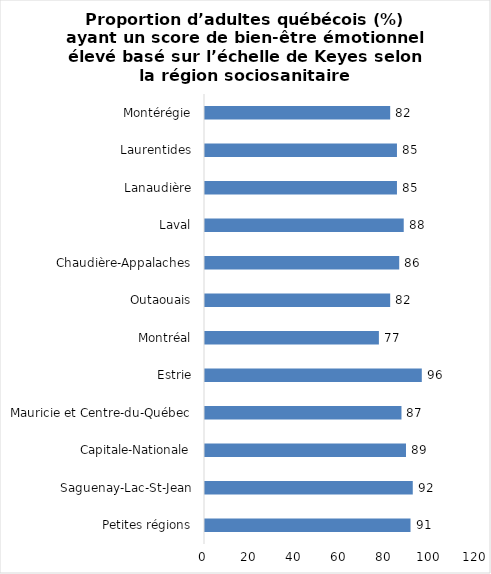
| Category | Series 0 |
|---|---|
| Petites régions | 91 |
| Saguenay-Lac-St-Jean | 92 |
| Capitale-Nationale | 89 |
| Mauricie et Centre-du-Québec | 87 |
| Estrie | 96 |
| Montréal | 77 |
| Outaouais | 82 |
| Chaudière-Appalaches | 86 |
| Laval | 88 |
| Lanaudière | 85 |
| Laurentides | 85 |
| Montérégie | 82 |